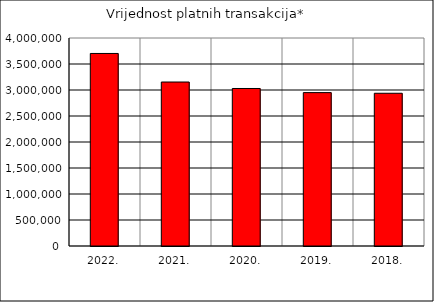
| Category | Vrijednost platnih transakcija* |
|---|---|
| 2022. | 3702644.188 |
| 2021. | 3153472.253 |
| 2020. | 3029085.749 |
| 2019. | 2949764.167 |
| 2018. | 2937307.09 |